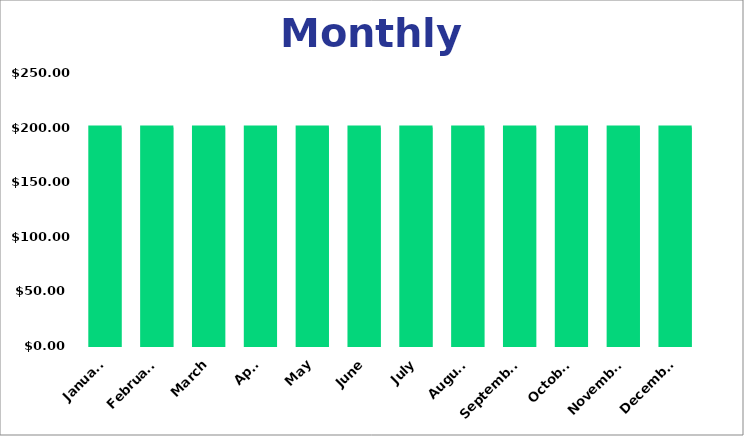
| Category | Savings |
|---|---|
| January | 200 |
| February | 200 |
| March | 200 |
| April | 200 |
| May | 200 |
| June | 200 |
| July | 200 |
| August | 200 |
| September | 200 |
| October | 200 |
| November | 200 |
| December | 200 |